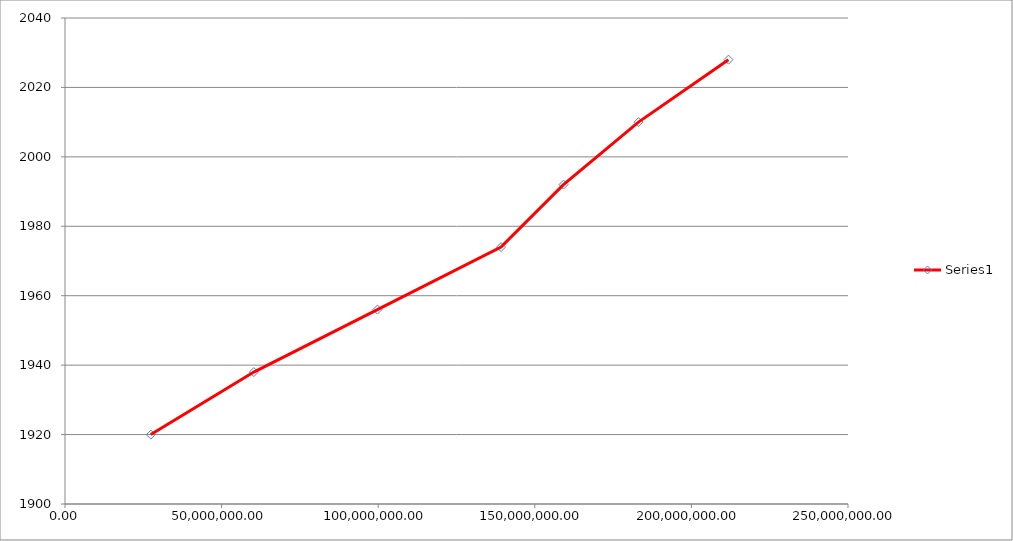
| Category | Series 0 |
|---|---|
| 27404000.0 | 1920 |
| 60288800.0 | 1938 |
| 99750560.0 | 1956 |
| 139212320.0 | 1974 |
| 159162432.0 | 1992 |
| 183102566.4 | 2010 |
| 211830727.68 | 2028 |